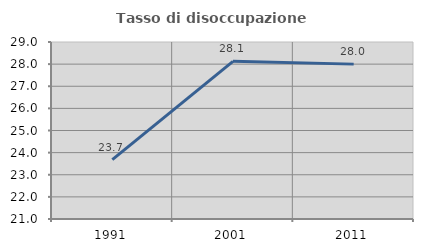
| Category | Tasso di disoccupazione giovanile  |
|---|---|
| 1991.0 | 23.684 |
| 2001.0 | 28.125 |
| 2011.0 | 28 |